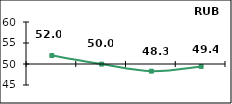
| Category | Диффузионный индекс* |
|---|---|
| 0 | 52.02 |
| 1 | 49.975 |
| 2 | 48.295 |
| 3 | 49.42 |